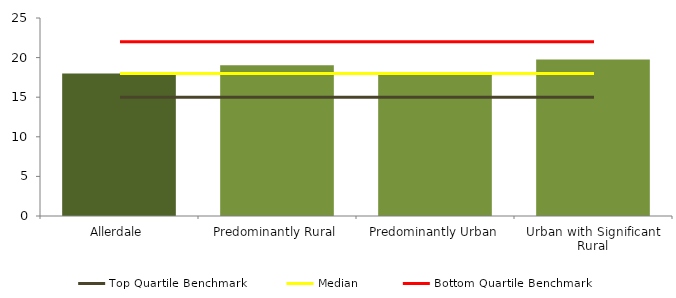
| Category | Series 0 |
|---|---|
| Allerdale | 18 |
| Predominantly Rural | 19.044 |
| Predominantly Urban | 18.06 |
| Urban with Significant Rural | 19.769 |